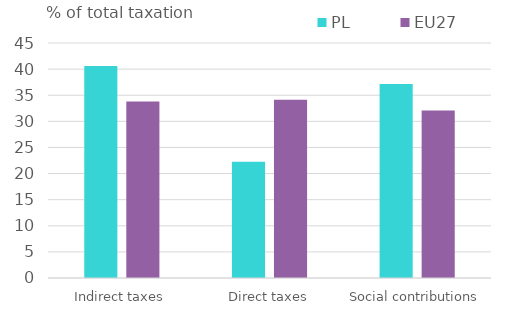
| Category | PL | EU27 |
|---|---|---|
| Indirect taxes | 40.591 | 33.811 |
| Direct taxes | 22.278 | 34.133 |
| Social contributions | 37.132 | 32.056 |